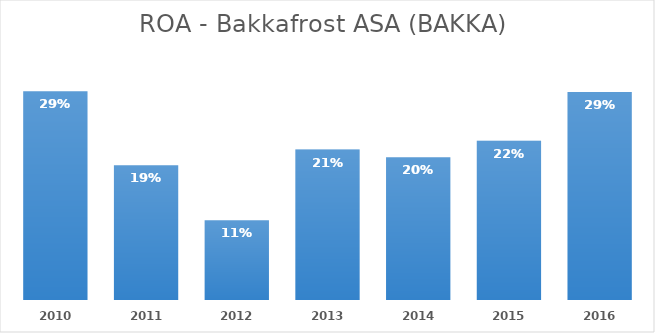
| Category | Series 0 |
|---|---|
| 2010.0 | 0.288 |
| 2011.0 | 0.186 |
| 2012.0 | 0.11 |
| 2013.0 | 0.207 |
| 2014.0 | 0.197 |
| 2015.0 | 0.219 |
| 2016.0 | 0.287 |